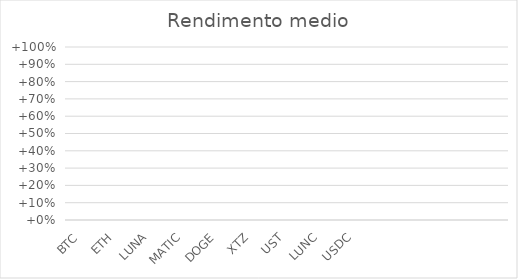
| Category | Rendimento medio |
|---|---|
| BTC | 0 |
| ETH | 0 |
| LUNA | 0 |
| MATIC | 0 |
| DOGE | 0 |
| XTZ | 0 |
| UST | 0 |
| LUNC | 0 |
| USDC | 0 |